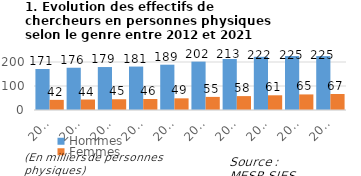
| Category | Hommes | Femmes |
|---|---|---|
| 2012 | 170.9 | 42.2 |
| 2013 | 176.1 | 43.7 |
| 2014 | 179 | 44.8 |
| 2015 | 181 | 45.8 |
| 2016 | 188.8 | 48.6 |
| 2017 | 201.6 | 54.6 |
| 2018 | 212.5 | 57.9 |
| 2019 | 221.7 | 61.3 |
| 2020 | 224.8 | 64.9 |
| 2021 | 224.5 | 66.6 |